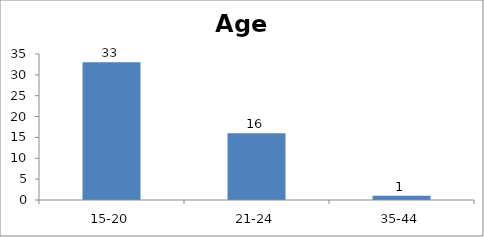
| Category | Age |
|---|---|
| 15-20 | 33 |
| 21-24 | 16 |
| 35-44 | 1 |